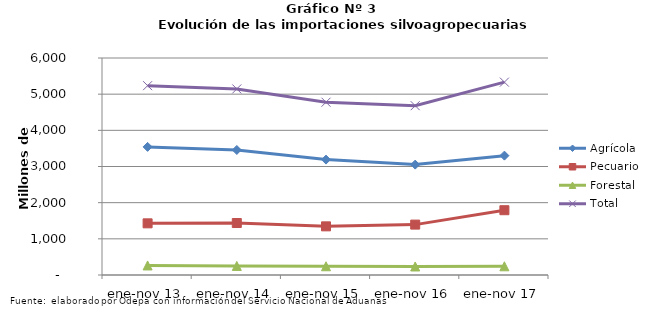
| Category | Agrícola | Pecuario | Forestal | Total |
|---|---|---|---|---|
| ene-nov 13 | 3542561 | 1428289 | 264390 | 5235240 |
| ene-nov 14 | 3456794 | 1437571 | 250639 | 5145004 |
| ene-nov 15 | 3190598 | 1344969 | 241847 | 4777414 |
| ene-nov 16 | 3052566 | 1393322 | 235879 | 4681767 |
| ene-nov 17 | 3300398 | 1791348 | 241061 | 5332807 |